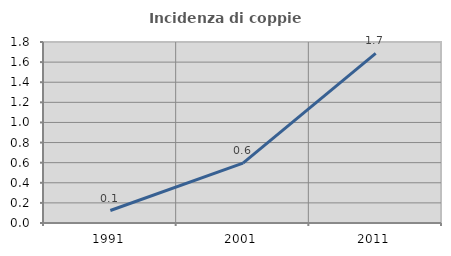
| Category | Incidenza di coppie miste |
|---|---|
| 1991.0 | 0.124 |
| 2001.0 | 0.596 |
| 2011.0 | 1.686 |